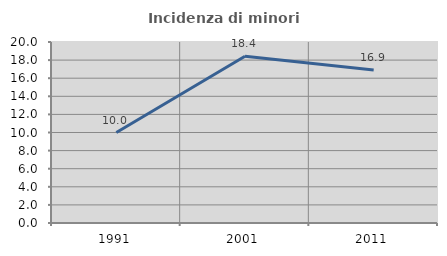
| Category | Incidenza di minori stranieri |
|---|---|
| 1991.0 | 10 |
| 2001.0 | 18.421 |
| 2011.0 | 16.901 |